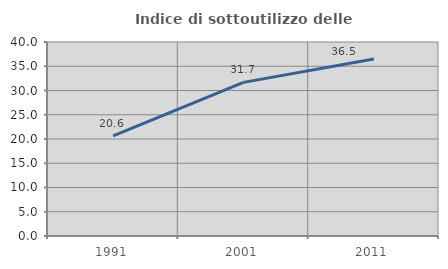
| Category | Indice di sottoutilizzo delle abitazioni  |
|---|---|
| 1991.0 | 20.635 |
| 2001.0 | 31.679 |
| 2011.0 | 36.496 |